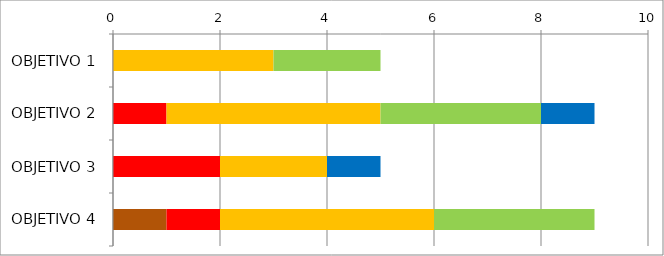
| Category | Series 0 | Series 1 | Series 2 | Series 3 | Series 4 | Series 5 |
|---|---|---|---|---|---|---|
| OBJETIVO 1 | 0 | 0 | 0 | 3 | 2 | 0 |
| OBJETIVO 2 | 0 | 0 | 1 | 4 | 3 | 1 |
| OBJETIVO 3 | 0 | 0 | 2 | 2 | 0 | 1 |
| OBJETIVO 4 | 1 | 0 | 1 | 4 | 3 | 0 |